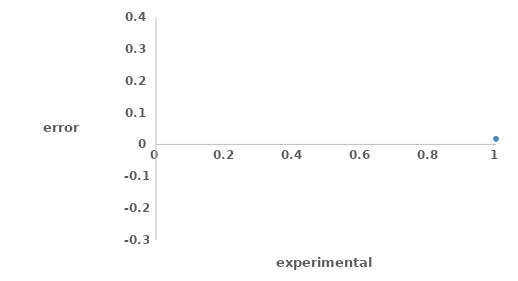
| Category | Series 0 |
|---|---|
| 0 | 0.018 |
| 1 | 0.108 |
| 2 | -0.122 |
| 3 | -0.002 |
| 4 | -0.27 |
| 5 | 0.2 |
| 6 | 0.11 |
| 7 | -0.04 |
| 8 | -0.045 |
| 9 | -0.165 |
| 10 | -0.115 |
| 11 | 0.325 |
| 12 | -0.125 |
| 13 | -0.035 |
| 14 | 0.005 |
| 15 | 0.155 |